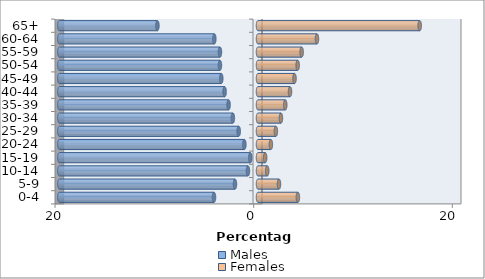
| Category | Males | Females |
|---|---|---|
| 0-4 | -4.429 | 4.016 |
| 5-9 | -2.318 | 2.112 |
| 10-14 | -1.01 | 0.928 |
| 15-19 | -0.771 | 0.722 |
| 20-24 | -1.372 | 1.294 |
| 25-29 | -1.942 | 1.799 |
| 30-34 | -2.529 | 2.308 |
| 35-39 | -2.962 | 2.744 |
| 40-44 | -3.362 | 3.221 |
| 45-49 | -3.697 | 3.674 |
| 50-54 | -3.831 | 3.994 |
| 55-59 | -3.829 | 4.395 |
| 60-64 | -4.397 | 5.936 |
| 65+ | -10.127 | 16.28 |